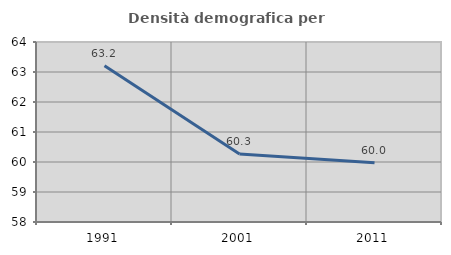
| Category | Densità demografica |
|---|---|
| 1991.0 | 63.208 |
| 2001.0 | 60.264 |
| 2011.0 | 59.977 |